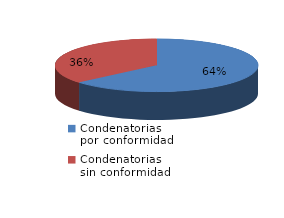
| Category | Series 0 |
|---|---|
| 0 | 2085 |
| 1 | 1186 |